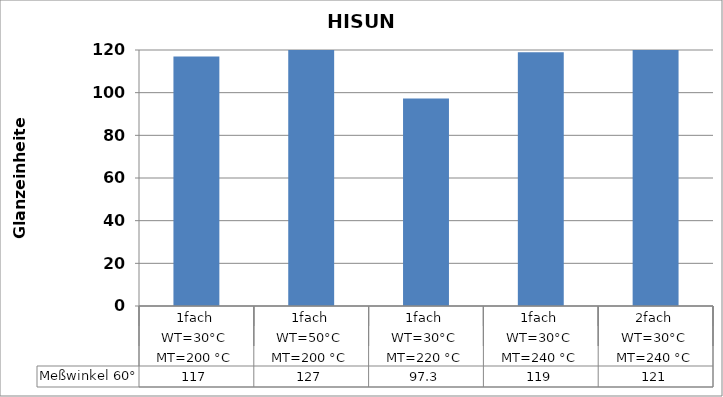
| Category | Meßwinkel 60° |
|---|---|
| 0 | 117 |
| 1 | 127 |
| 2 | 97.3 |
| 3 | 119 |
| 4 | 121 |